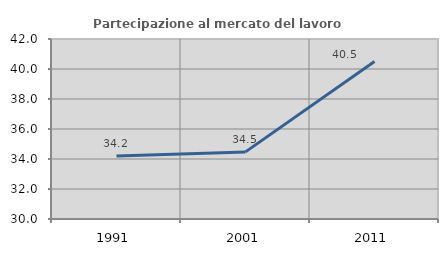
| Category | Partecipazione al mercato del lavoro  femminile |
|---|---|
| 1991.0 | 34.201 |
| 2001.0 | 34.475 |
| 2011.0 | 40.503 |